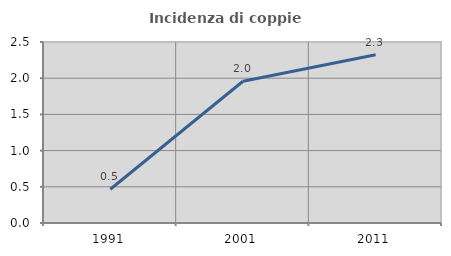
| Category | Incidenza di coppie miste |
|---|---|
| 1991.0 | 0.466 |
| 2001.0 | 1.958 |
| 2011.0 | 2.323 |